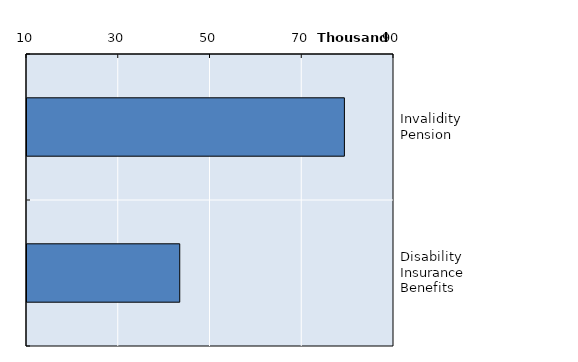
| Category | Series 0 |
|---|---|
| Invalidity Pension | 79187 |
| Disability Insurance Benefits | 43295 |